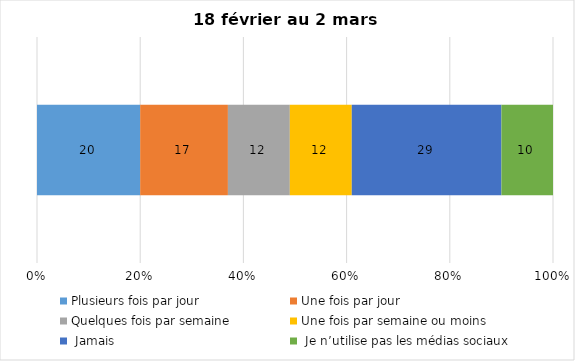
| Category | Plusieurs fois par jour | Une fois par jour | Quelques fois par semaine   | Une fois par semaine ou moins   |  Jamais   |  Je n’utilise pas les médias sociaux |
|---|---|---|---|---|---|---|
| 0 | 20 | 17 | 12 | 12 | 29 | 10 |